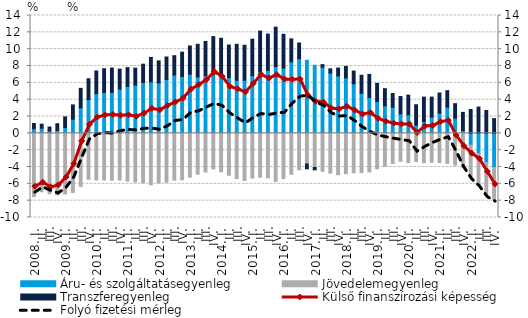
| Category | Áru- és szolgáltatásegyenleg | Jövedelemegyenleg | Transzferegyenleg |
|---|---|---|---|
| 2008. I. | 0.541 | -7.513 | 0.629 |
|          II. | 0.609 | -6.945 | 0.477 |
|          III. | 0.273 | -7.172 | 0.473 |
|          IV. | 0.346 | -7.33 | 0.793 |
| 2009. I. | 0.706 | -7.199 | 1.252 |
|          II. | 1.676 | -7.027 | 1.702 |
|          III. | 3.028 | -6.31 | 2.319 |
|          IV. | 4.008 | -5.461 | 2.475 |
| 2010. I. | 4.718 | -5.542 | 2.696 |
|          II. | 4.856 | -5.548 | 2.822 |
|          III. | 4.875 | -5.569 | 2.881 |
|          IV. | 5.259 | -5.545 | 2.37 |
| 2011. I. | 5.584 | -5.666 | 2.229 |
|          II. | 5.738 | -5.787 | 2.01 |
|          III. | 6.051 | -5.869 | 2.165 |
|          IV. | 6.114 | -6.109 | 2.905 |
| 2012. I. | 5.99 | -5.885 | 2.621 |
|          II. | 6.405 | -5.809 | 2.664 |
|          III. | 6.932 | -5.562 | 2.291 |
|          IV. | 6.749 | -5.515 | 2.895 |
| 2013. I. | 7.032 | -5.201 | 3.352 |
| II. | 6.701 | -4.855 | 3.878 |
|          III. | 6.881 | -4.589 | 4.034 |
| IV. | 6.971 | -4.23 | 4.522 |
| 2014. I. | 7.036 | -4.566 | 4.26 |
| II. | 6.623 | -4.977 | 3.871 |
|          III. | 6.307 | -5.364 | 4.275 |
| IV. | 6.316 | -5.599 | 4.145 |
| 2015. I. | 6.838 | -5.309 | 4.35 |
| II. | 7.308 | -5.216 | 4.842 |
|          III. | 7.477 | -5.283 | 4.32 |
| IV. | 7.943 | -5.693 | 4.673 |
| 2016. I. | 7.764 | -5.377 | 4.002 |
| II. | 8.503 | -4.87 | 2.723 |
|          III. | 8.868 | -4.329 | 1.866 |
| IV. | 8.672 | -3.641 | -0.569 |
| 2017. I. | 8.089 | -4.054 | -0.284 |
| II. | 7.862 | -4.508 | 0.303 |
|          III. | 7.163 | -4.725 | 0.502 |
| IV. | 6.82 | -4.916 | 0.941 |
| 2018. I. | 6.595 | -4.794 | 1.358 |
| II. | 5.894 | -4.689 | 1.507 |
|          III. | 4.759 | -4.663 | 2.139 |
| IV. | 4.267 | -4.589 | 2.734 |
| 2019. I. | 3.779 | -4.209 | 2.157 |
| II. | 3.275 | -3.931 | 2.033 |
|          III. | 3.104 | -3.58 | 1.627 |
| IV. | 2.325 | -3.324 | 2.048 |
| 2020. I. | 2.215 | -3.479 | 2.325 |
| II. | 0.977 | -3.354 | 2.42 |
|          III. | 1.408 | -3.475 | 2.895 |
| IV. | 1.939 | -3.439 | 2.367 |
| 2021. I. | 2.403 | -3.475 | 2.393 |
| II. | 3.122 | -3.57 | 1.946 |
|          III. | 1.801 | -3.775 | 1.72 |
| IV. | 0.317 | -4.018 | 2.174 |
| 2022. I. | -1.405 | -3.839 | 2.832 |
| II. | -2.388 | -3.805 | 3.124 |
|          III. | -3.48 | -3.823 | 2.714 |
| IV. | -4.046 | -3.783 | 1.748 |